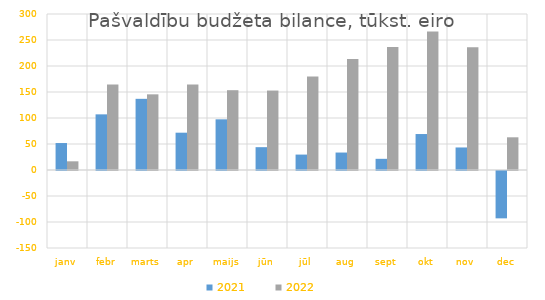
| Category | 2021 | 2022 |
|---|---|---|
| janv | 51841.777 | 16703.923 |
| febr | 107011.894 | 164205.671 |
| marts | 136866.315 | 145513.563 |
| apr | 71755.584 | 164636.583 |
| maijs | 97451.146 | 153483.094 |
| jūn | 43904.827 | 152800.466 |
| jūl | 29653.452 | 179788.756 |
| aug | 33579 | 213558.674 |
| sept | 21501.571 | 236659.668 |
| okt | 69163.685 | 266405.755 |
| nov | 43347 | 235826.103 |
| dec | -91047.788 | 62884.159 |